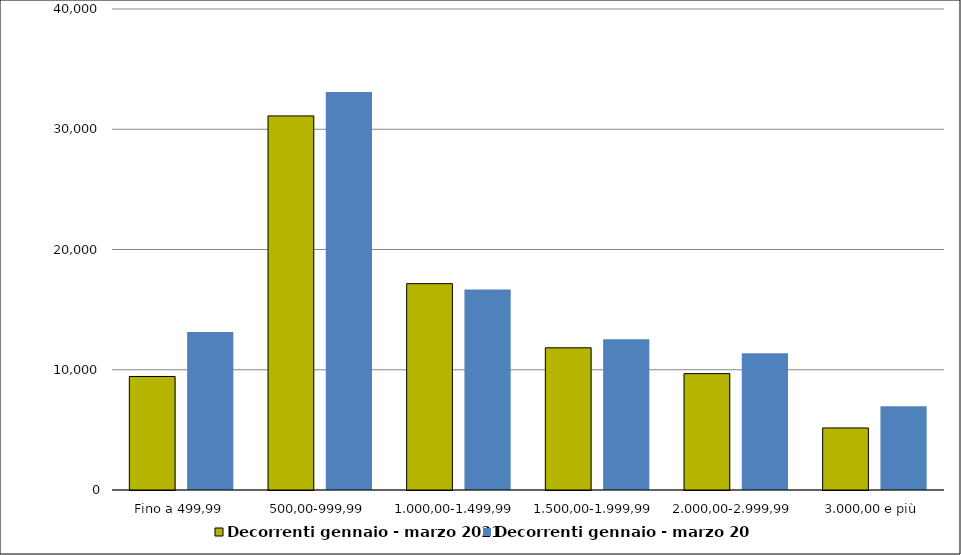
| Category | Decorrenti gennaio - marzo 2021 | Decorrenti gennaio - marzo 2020 |
|---|---|---|
| Fino a 499,99 | 9441 | 13139 |
| 500,00-999,99 | 31109 | 33090 |
| 1.000,00-1.499,99 | 17159 | 16664 |
| 1.500,00-1.999,99 | 11825 | 12526 |
| 2.000,00-2.999,99 | 9678 | 11368 |
| 3.000,00 e più | 5159 | 6971 |